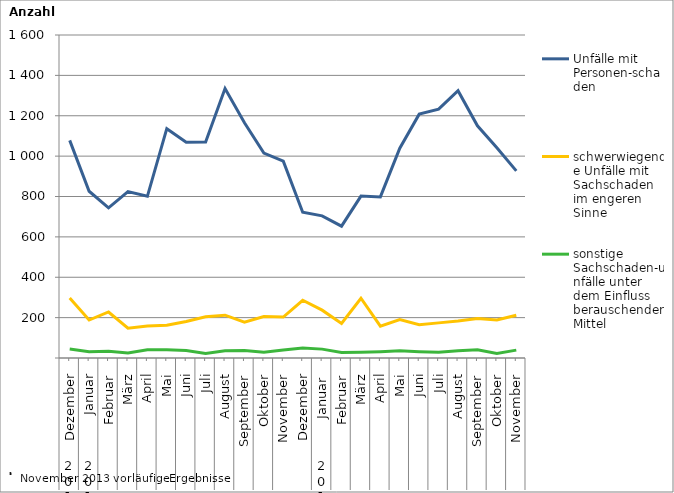
| Category | Unfälle mit Personen-schaden | schwerwiegende Unfälle mit Sachschaden   im engeren Sinne | sonstige Sachschaden-unfälle unter dem Einfluss berauschender Mittel |
|---|---|---|---|
| 0 | 1078 | 297 | 45 |
| 1 | 826 | 188 | 31 |
| 2 | 744 | 228 | 34 |
| 3 | 824 | 148 | 25 |
| 4 | 801 | 159 | 41 |
| 5 | 1136 | 162 | 41 |
| 6 | 1069 | 181 | 37 |
| 7 | 1070 | 204 | 22 |
| 8 | 1335 | 212 | 36 |
| 9 | 1165 | 177 | 37 |
| 10 | 1015 | 205 | 28 |
| 11 | 975 | 203 | 40 |
| 12 | 722 | 286 | 50 |
| 13 | 704 | 237 | 44 |
| 14 | 653 | 171 | 27 |
| 15 | 802 | 296 | 28 |
| 16 | 798 | 158 | 31 |
| 17 | 1039 | 190 | 36 |
| 18 | 1208 | 165 | 31 |
| 19 | 1233 | 174 | 28 |
| 20 | 1324 | 183 | 36 |
| 21 | 1150 | 196 | 41 |
| 22 | 1041 | 188 | 22 |
| 23 | 927 | 212 | 39 |